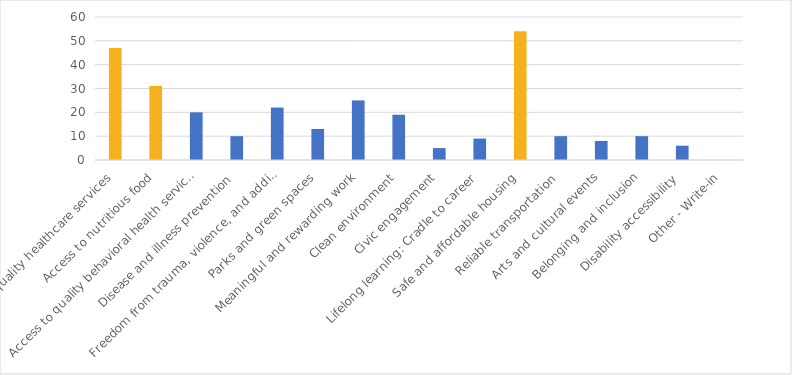
| Category | Number of Responses |
|---|---|
| Access to quality healthcare services | 47 |
| Access to nutritious food | 31 |
| Access to quality behavioral health services | 20 |
| Disease and illness prevention | 10 |
| Freedom from trauma, violence, and addiction | 22 |
| Parks and green spaces | 13 |
| Meaningful and rewarding work | 25 |
| Clean environment | 19 |
| Civic engagement | 5 |
| Lifelong learning: Cradle to career | 9 |
| Safe and affordable housing | 54 |
| Reliable transportation | 10 |
| Arts and cultural events | 8 |
| Belonging and inclusion | 10 |
| Disability accessibility | 6 |
| Other - Write-in | 0 |